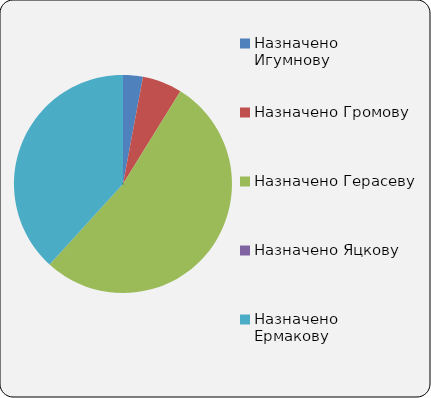
| Category | Series 0 |
|---|---|
| Назначено Игумнову | 1 |
| Назначено Громову | 2 |
| Назначено Герасеву | 18 |
| Назначено Яцкову | 0 |
| Назначено Ермакову | 13 |